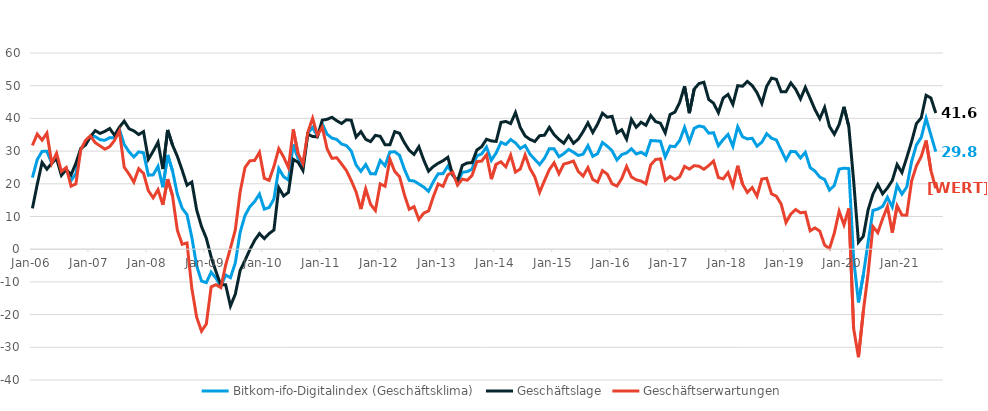
| Category | Bitkom-ifo-Digitalindex (Geschäftsklima) | Geschäftslage | Geschäftserwartungen |
|---|---|---|---|
| 2006-01-01 | 21.91 | 12.49 | 31.75 |
| 2006-02-01 | 27.39 | 19.83 | 35.21 |
| 2006-03-01 | 29.91 | 26.52 | 33.36 |
| 2006-04-01 | 29.93 | 24.48 | 35.51 |
| 2006-05-01 | 26.29 | 26.29 | 26.28 |
| 2006-06-01 | 28.52 | 27.71 | 29.33 |
| 2006-07-01 | 23.19 | 22.58 | 23.8 |
| 2006-08-01 | 24.67 | 24.35 | 24.99 |
| 2006-09-01 | 21.01 | 22.75 | 19.28 |
| 2006-10-01 | 23.11 | 26.28 | 19.98 |
| 2006-11-01 | 30.56 | 30.78 | 30.33 |
| 2006-12-01 | 32.58 | 31.87 | 33.29 |
| 2007-01-01 | 34.53 | 34.4 | 34.67 |
| 2007-02-01 | 34.43 | 36.27 | 32.59 |
| 2007-03-01 | 33.49 | 35.41 | 31.59 |
| 2007-04-01 | 33.3 | 36.04 | 30.59 |
| 2007-05-01 | 34.12 | 36.91 | 31.37 |
| 2007-06-01 | 34.05 | 34.83 | 33.27 |
| 2007-07-01 | 36.73 | 37.29 | 36.17 |
| 2007-08-01 | 32.03 | 39.17 | 25.09 |
| 2007-09-01 | 29.79 | 36.83 | 22.97 |
| 2007-10-01 | 28.21 | 36.18 | 20.51 |
| 2007-11-01 | 29.77 | 35.06 | 24.61 |
| 2007-12-01 | 29.49 | 35.96 | 23.19 |
| 2008-01-01 | 22.63 | 27.49 | 17.88 |
| 2008-02-01 | 22.73 | 29.97 | 15.72 |
| 2008-03-01 | 25.34 | 32.72 | 18.19 |
| 2008-04-01 | 18.96 | 24.51 | 13.55 |
| 2008-05-01 | 28.82 | 36.46 | 21.43 |
| 2008-06-01 | 23.97 | 31.85 | 16.36 |
| 2008-07-01 | 16.81 | 28.4 | 5.81 |
| 2008-08-01 | 12.53 | 24.16 | 1.5 |
| 2008-09-01 | 10.56 | 19.57 | 1.91 |
| 2008-10-01 | 3.61 | 20.53 | -12.01 |
| 2008-11-01 | -5.08 | 12.02 | -20.79 |
| 2008-12-01 | -9.73 | 6.95 | -25.06 |
| 2009-01-01 | -10.22 | 3.34 | -22.88 |
| 2009-02-01 | -7.01 | -2.38 | -11.52 |
| 2009-03-01 | -8.87 | -6.86 | -10.86 |
| 2009-04-01 | -11.32 | -10.9 | -11.74 |
| 2009-05-01 | -7.9 | -10.87 | -4.88 |
| 2009-06-01 | -8.71 | -17.37 | 0.35 |
| 2009-07-01 | -4.17 | -13.75 | 5.89 |
| 2009-08-01 | 5.16 | -6.5 | 17.52 |
| 2009-09-01 | 10.28 | -3.44 | 24.95 |
| 2009-10-01 | 12.98 | -0.19 | 27.02 |
| 2009-11-01 | 14.58 | 2.71 | 27.15 |
| 2009-12-01 | 16.85 | 4.79 | 29.63 |
| 2010-01-01 | 12.26 | 3.24 | 21.68 |
| 2010-02-01 | 12.76 | 4.77 | 21.05 |
| 2010-03-01 | 15.38 | 5.87 | 25.33 |
| 2010-04-01 | 24.69 | 18.79 | 30.74 |
| 2010-05-01 | 22.18 | 16.28 | 28.23 |
| 2010-06-01 | 21.13 | 17.38 | 24.95 |
| 2010-07-01 | 32 | 27.48 | 36.61 |
| 2010-08-01 | 27.89 | 26.59 | 29.19 |
| 2010-09-01 | 25.12 | 24.08 | 26.16 |
| 2010-10-01 | 35.43 | 35.17 | 35.68 |
| 2010-11-01 | 37.23 | 34.46 | 40.04 |
| 2010-12-01 | 34.59 | 34.38 | 34.79 |
| 2011-01-01 | 38.39 | 39.46 | 37.34 |
| 2011-02-01 | 35.16 | 39.72 | 30.68 |
| 2011-03-01 | 33.98 | 40.34 | 27.79 |
| 2011-04-01 | 33.56 | 39.29 | 27.97 |
| 2011-05-01 | 32.15 | 38.43 | 26.05 |
| 2011-06-01 | 31.69 | 39.58 | 24.06 |
| 2011-07-01 | 30.03 | 39.44 | 20.99 |
| 2011-08-01 | 25.76 | 34.29 | 17.54 |
| 2011-09-01 | 23.81 | 35.96 | 12.28 |
| 2011-10-01 | 25.89 | 33.6 | 18.44 |
| 2011-11-01 | 23.1 | 32.9 | 13.72 |
| 2011-12-01 | 23.02 | 34.81 | 11.83 |
| 2012-01-01 | 27.13 | 34.52 | 19.97 |
| 2012-02-01 | 25.52 | 31.95 | 19.26 |
| 2012-03-01 | 29.71 | 31.93 | 27.5 |
| 2012-04-01 | 29.79 | 35.95 | 23.79 |
| 2012-05-01 | 28.71 | 35.44 | 22.18 |
| 2012-06-01 | 24.49 | 32.57 | 16.69 |
| 2012-07-01 | 21.05 | 30.26 | 12.21 |
| 2012-08-01 | 20.85 | 28.97 | 13.02 |
| 2012-09-01 | 19.94 | 31.35 | 9.1 |
| 2012-10-01 | 19 | 27.29 | 11.02 |
| 2012-11-01 | 17.69 | 23.86 | 11.69 |
| 2012-12-01 | 20.64 | 25.28 | 16.1 |
| 2013-01-01 | 23.09 | 26.28 | 19.94 |
| 2013-02-01 | 23.11 | 27.06 | 19.22 |
| 2013-03-01 | 25.41 | 28.12 | 22.74 |
| 2013-04-01 | 23.14 | 22.69 | 23.58 |
| 2013-05-01 | 20.25 | 20.9 | 19.61 |
| 2013-06-01 | 23.52 | 25.63 | 21.43 |
| 2013-07-01 | 23.72 | 26.38 | 21.09 |
| 2013-08-01 | 24.48 | 26.44 | 22.53 |
| 2013-09-01 | 28.54 | 30.33 | 26.76 |
| 2013-10-01 | 29.14 | 31.36 | 26.94 |
| 2013-11-01 | 31.24 | 33.62 | 28.89 |
| 2013-12-01 | 27.18 | 33.11 | 21.41 |
| 2014-01-01 | 29.45 | 32.96 | 26 |
| 2014-02-01 | 32.68 | 38.79 | 26.72 |
| 2014-03-01 | 32.02 | 39.07 | 25.18 |
| 2014-04-01 | 33.54 | 38.41 | 28.77 |
| 2014-05-01 | 32.51 | 41.79 | 23.58 |
| 2014-06-01 | 30.79 | 37.22 | 24.53 |
| 2014-07-01 | 31.7 | 34.63 | 28.81 |
| 2014-08-01 | 29.08 | 33.58 | 24.67 |
| 2014-09-01 | 27.45 | 32.93 | 22.11 |
| 2014-10-01 | 25.89 | 34.71 | 17.4 |
| 2014-11-01 | 27.8 | 34.85 | 20.95 |
| 2014-12-01 | 30.7 | 37.27 | 24.32 |
| 2015-01-01 | 30.69 | 35.03 | 26.42 |
| 2015-02-01 | 28.27 | 33.57 | 23.08 |
| 2015-03-01 | 29.2 | 32.4 | 26.03 |
| 2015-04-01 | 30.52 | 34.67 | 26.44 |
| 2015-05-01 | 29.66 | 32.39 | 26.96 |
| 2015-06-01 | 28.67 | 33.66 | 23.78 |
| 2015-07-01 | 29.06 | 35.96 | 22.36 |
| 2015-08-01 | 31.68 | 38.63 | 24.94 |
| 2015-09-01 | 28.4 | 35.68 | 21.34 |
| 2015-10-01 | 29.21 | 38.26 | 20.5 |
| 2015-11-01 | 32.64 | 41.59 | 24.03 |
| 2015-12-01 | 31.5 | 40.35 | 22.98 |
| 2016-01-01 | 30.08 | 40.63 | 19.99 |
| 2016-02-01 | 27.29 | 35.56 | 19.3 |
| 2016-03-01 | 28.94 | 36.53 | 21.6 |
| 2016-04-01 | 29.43 | 33.64 | 25.3 |
| 2016-05-01 | 30.72 | 39.69 | 22.1 |
| 2016-06-01 | 29.11 | 37.29 | 21.22 |
| 2016-07-01 | 29.65 | 38.82 | 20.84 |
| 2016-08-01 | 28.77 | 37.89 | 20.01 |
| 2016-09-01 | 33.22 | 40.88 | 25.8 |
| 2016-10-01 | 33.16 | 39.04 | 27.43 |
| 2016-11-01 | 33.02 | 38.54 | 27.62 |
| 2016-12-01 | 28.21 | 35.57 | 21.09 |
| 2017-01-01 | 31.53 | 41.19 | 22.25 |
| 2017-02-01 | 31.36 | 41.91 | 21.28 |
| 2017-03-01 | 33.26 | 44.92 | 22.15 |
| 2017-04-01 | 37.26 | 49.83 | 25.33 |
| 2017-05-01 | 32.89 | 41.6 | 24.49 |
| 2017-06-01 | 36.98 | 48.98 | 25.56 |
| 2017-07-01 | 37.68 | 50.66 | 25.37 |
| 2017-08-01 | 37.38 | 51.06 | 24.44 |
| 2017-09-01 | 35.47 | 45.8 | 25.58 |
| 2017-10-01 | 35.63 | 44.65 | 26.95 |
| 2017-11-01 | 31.63 | 41.75 | 21.93 |
| 2017-12-01 | 33.54 | 46.23 | 21.51 |
| 2018-01-01 | 35.09 | 47.34 | 23.44 |
| 2018-02-01 | 31.48 | 44.29 | 19.34 |
| 2018-03-01 | 37.45 | 50.01 | 25.52 |
| 2018-04-01 | 34.4 | 49.84 | 19.92 |
| 2018-05-01 | 33.71 | 51.3 | 17.35 |
| 2018-06-01 | 33.93 | 50.05 | 18.85 |
| 2018-07-01 | 31.51 | 47.87 | 16.22 |
| 2018-08-01 | 32.73 | 44.57 | 21.47 |
| 2018-09-01 | 35.32 | 49.8 | 21.68 |
| 2018-10-01 | 33.95 | 52.32 | 16.93 |
| 2018-11-01 | 33.39 | 51.94 | 16.22 |
| 2018-12-01 | 30.34 | 48.16 | 13.8 |
| 2019-01-01 | 27.27 | 48.16 | 8.15 |
| 2019-02-01 | 29.93 | 50.84 | 10.77 |
| 2019-03-01 | 29.79 | 48.92 | 12.13 |
| 2019-04-01 | 27.88 | 45.95 | 11.13 |
| 2019-05-01 | 29.62 | 49.49 | 11.33 |
| 2019-06-01 | 24.97 | 46.14 | 5.63 |
| 2019-07-01 | 23.88 | 42.7 | 6.51 |
| 2019-08-01 | 22.04 | 39.91 | 5.5 |
| 2019-09-01 | 21.3 | 43.35 | 1.24 |
| 2019-10-01 | 18.06 | 37.54 | 0.17 |
| 2019-11-01 | 19.53 | 35.16 | 4.93 |
| 2019-12-01 | 24.48 | 38.14 | 11.61 |
| 2020-01-01 | 24.78 | 43.55 | 7.46 |
| 2020-02-01 | 24.64 | 37.53 | 12.45 |
| 2020-03-01 | -2.94 | 20.96 | -24.25 |
| 2020-04-01 | -16.28 | 2.14 | -33.02 |
| 2020-05-01 | -7.9 | 3.94 | -19.05 |
| 2020-06-01 | 2.1 | 12.03 | -7.35 |
| 2020-07-01 | 11.83 | 16.85 | 6.94 |
| 2020-08-01 | 12.29 | 19.79 | 5.04 |
| 2020-09-01 | 13.09 | 16.94 | 9.3 |
| 2020-10-01 | 15.9 | 18.74 | 13.09 |
| 2020-11-01 | 12.89 | 21.01 | 5.07 |
| 2020-12-01 | 19.49 | 25.9 | 13.26 |
| 2021-01-01 | 16.86 | 23.44 | 10.48 |
| 2021-02-01 | 19.03 | 28.02 | 10.41 |
| 2021-03-01 | 26.79 | 32.9 | 20.85 |
| 2021-04-01 | 31.88 | 38.42 | 25.52 |
| 2021-05-01 | 34.21 | 40.18 | 28.4 |
| 2021-06-01 | 40.04 | 47.06 | 33.22 |
| 2021-07-01 | 34.89 | 46.24 | 24.05 |
| 2021-08-01 | 29.82 | 41.64 | 18.58 |